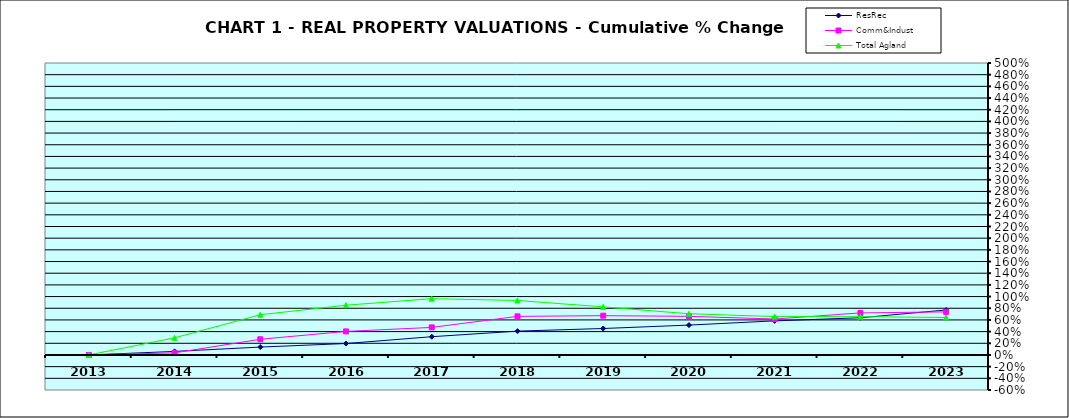
| Category | ResRec | Comm&Indust | Total Agland |
|---|---|---|---|
| 2013.0 | 0 | 0 | 0 |
| 2014.0 | 0.061 | 0.036 | 0.293 |
| 2015.0 | 0.135 | 0.269 | 0.689 |
| 2016.0 | 0.196 | 0.403 | 0.852 |
| 2017.0 | 0.313 | 0.472 | 0.964 |
| 2018.0 | 0.408 | 0.661 | 0.933 |
| 2019.0 | 0.453 | 0.673 | 0.824 |
| 2020.0 | 0.512 | 0.662 | 0.705 |
| 2021.0 | 0.584 | 0.615 | 0.658 |
| 2022.0 | 0.637 | 0.72 | 0.655 |
| 2023.0 | 0.77 | 0.738 | 0.641 |